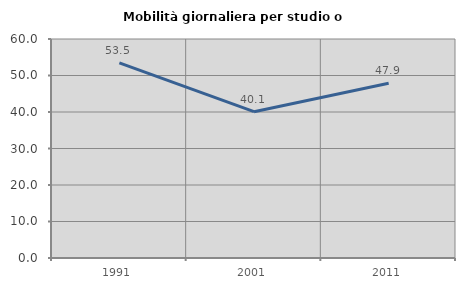
| Category | Mobilità giornaliera per studio o lavoro |
|---|---|
| 1991.0 | 53.474 |
| 2001.0 | 40.082 |
| 2011.0 | 47.886 |